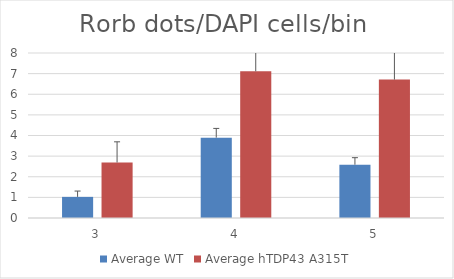
| Category | Average WT | Average hTDP43 A315T |
|---|---|---|
| 3.0 | 1.024 | 2.69 |
| 4.0 | 3.897 | 7.111 |
| 5.0 | 2.583 | 6.711 |